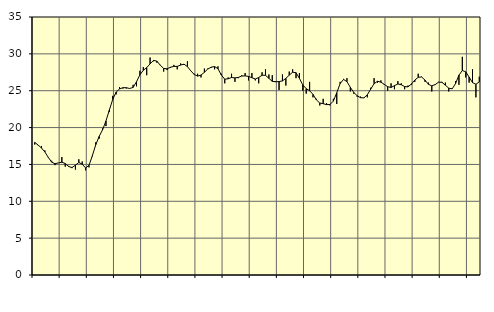
| Category | Piggar | Series 1 |
|---|---|---|
| nan | 17.7 | 17.99 |
| 87.0 | 17.6 | 17.63 |
| 87.0 | 17.5 | 17.23 |
| 87.0 | 16.9 | 16.69 |
| nan | 15.9 | 15.96 |
| 88.0 | 15.5 | 15.31 |
| 88.0 | 14.9 | 15.1 |
| 88.0 | 15.2 | 15.21 |
| nan | 16 | 15.3 |
| 89.0 | 14.7 | 15.12 |
| 89.0 | 14.8 | 14.72 |
| 89.0 | 14.5 | 14.57 |
| nan | 14.3 | 14.9 |
| 90.0 | 15.7 | 15.26 |
| 90.0 | 15.4 | 15.03 |
| 90.0 | 14.2 | 14.53 |
| nan | 14.6 | 14.87 |
| 91.0 | 16.1 | 16.2 |
| 91.0 | 18 | 17.69 |
| 91.0 | 18.5 | 18.8 |
| nan | 19.9 | 19.7 |
| 92.0 | 20.2 | 20.9 |
| 92.0 | 22.1 | 22.39 |
| 92.0 | 24.3 | 23.83 |
| nan | 24.5 | 24.81 |
| 93.0 | 25.5 | 25.24 |
| 93.0 | 25.3 | 25.41 |
| 93.0 | 25.3 | 25.41 |
| nan | 25.3 | 25.3 |
| 94.0 | 25.8 | 25.45 |
| 94.0 | 25.6 | 26.22 |
| 94.0 | 27.7 | 27.16 |
| nan | 28.2 | 27.76 |
| 95.0 | 27.1 | 28.14 |
| 95.0 | 29.5 | 28.64 |
| 95.0 | 29 | 29.11 |
| nan | 28.8 | 29.02 |
| 96.0 | 28.5 | 28.46 |
| 96.0 | 27.6 | 28.02 |
| 96.0 | 27.8 | 27.97 |
| nan | 28.1 | 28.18 |
| 97.0 | 28.5 | 28.3 |
| 97.0 | 27.9 | 28.3 |
| 97.0 | 28.7 | 28.48 |
| nan | 28.5 | 28.6 |
| 98.0 | 29 | 28.27 |
| 98.0 | 27.7 | 27.69 |
| 98.0 | 27.3 | 27.21 |
| nan | 27.3 | 26.98 |
| 99.0 | 26.8 | 27.12 |
| 99.0 | 28 | 27.5 |
| 99.0 | 28 | 27.94 |
| nan | 28.1 | 28.19 |
| 0.0 | 27.9 | 28.28 |
| 0.0 | 28.3 | 27.98 |
| 0.0 | 27.3 | 27.12 |
| nan | 26 | 26.56 |
| 1.0 | 26.8 | 26.62 |
| 1.0 | 27.3 | 26.79 |
| 1.0 | 26.2 | 26.74 |
| nan | 26.7 | 26.8 |
| 2.0 | 27.1 | 26.99 |
| 2.0 | 27.4 | 27.01 |
| 2.0 | 26.4 | 26.94 |
| nan | 27.4 | 26.76 |
| 3.0 | 26.4 | 26.59 |
| 3.0 | 26 | 26.79 |
| 3.0 | 27.5 | 27.1 |
| nan | 27.9 | 27.09 |
| 4.0 | 27.2 | 26.68 |
| 4.0 | 27.1 | 26.27 |
| 4.0 | 26.3 | 26.21 |
| nan | 25.1 | 26.24 |
| 5.0 | 27.2 | 26.33 |
| 5.0 | 25.7 | 26.68 |
| 5.0 | 27.6 | 27.11 |
| nan | 27.9 | 27.5 |
| 6.0 | 26.7 | 27.45 |
| 6.0 | 27.4 | 26.67 |
| 6.0 | 25 | 25.79 |
| nan | 24.6 | 25.28 |
| 7.0 | 26.2 | 24.99 |
| 7.0 | 24.1 | 24.5 |
| 7.0 | 23.9 | 23.75 |
| nan | 23 | 23.33 |
| 8.0 | 23.9 | 23.24 |
| 8.0 | 23.3 | 23.11 |
| 8.0 | 23 | 23.13 |
| nan | 23.9 | 23.59 |
| 9.0 | 23.2 | 24.72 |
| 9.0 | 26.2 | 25.97 |
| 9.0 | 26.6 | 26.53 |
| nan | 26.7 | 26.23 |
| 10.0 | 24.9 | 25.46 |
| 10.0 | 24.6 | 24.77 |
| 10.0 | 24.2 | 24.32 |
| nan | 24.2 | 24.05 |
| 11.0 | 24 | 24.03 |
| 11.0 | 24.1 | 24.44 |
| 11.0 | 25.4 | 25.22 |
| nan | 26.7 | 25.95 |
| 12.0 | 26.1 | 26.28 |
| 12.0 | 26.4 | 26.16 |
| 12.0 | 25.8 | 25.86 |
| nan | 25 | 25.55 |
| 13.0 | 26 | 25.44 |
| 13.0 | 25.2 | 25.69 |
| 13.0 | 26.3 | 25.91 |
| nan | 26 | 25.81 |
| 14.0 | 25.2 | 25.56 |
| 14.0 | 25.7 | 25.52 |
| 14.0 | 25.8 | 25.91 |
| nan | 26.2 | 26.44 |
| 15.0 | 27.3 | 26.82 |
| 15.0 | 26.9 | 26.86 |
| 15.0 | 26.2 | 26.44 |
| nan | 26.1 | 25.87 |
| 16.0 | 24.9 | 25.66 |
| 16.0 | 25.9 | 25.83 |
| 16.0 | 26.2 | 26.16 |
| nan | 26.2 | 26.14 |
| 17.0 | 26.1 | 25.75 |
| 17.0 | 24.9 | 25.35 |
| 17.0 | 25.3 | 25.25 |
| nan | 26.3 | 25.96 |
| 18.0 | 25.8 | 27.12 |
| 18.0 | 29.6 | 27.74 |
| 18.0 | 26.8 | 27.57 |
| nan | 26.1 | 26.85 |
| 19.0 | 27.9 | 26.1 |
| 19.0 | 24.1 | 25.87 |
| 19.0 | 26.9 | 26.21 |